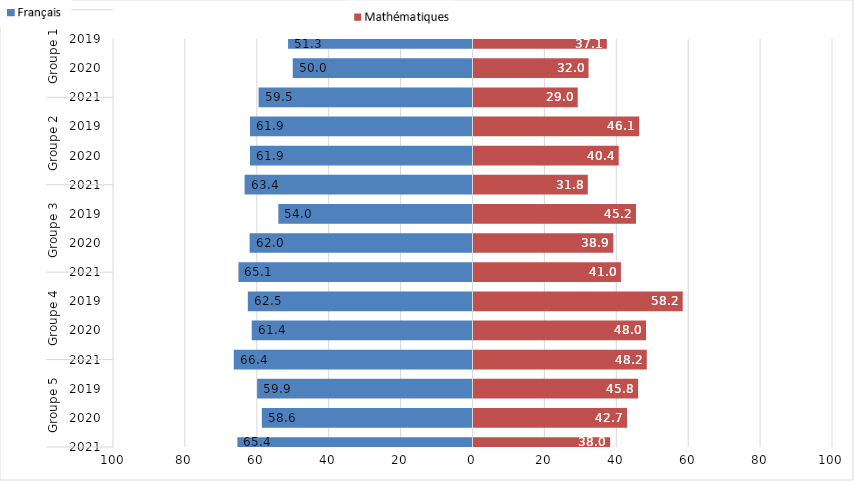
| Category | Français | Mathématiques |
|---|---|---|
| 0 | -65.4 | 38 |
| 1 | -58.6 | 42.7 |
| 2 | -59.9 | 45.8 |
| 3 | -66.4 | 48.2 |
| 4 | -61.4 | 48 |
| 5 | -62.5 | 58.2 |
| 6 | -65.1 | 41 |
| 7 | -62 | 38.9 |
| 8 | -54 | 45.2 |
| 9 | -63.4 | 31.8 |
| 10 | -61.9 | 40.4 |
| 11 | -61.9 | 46.1 |
| 12 | -59.5 | 29 |
| 13 | -50 | 32 |
| 14 | -51.3 | 37.1 |